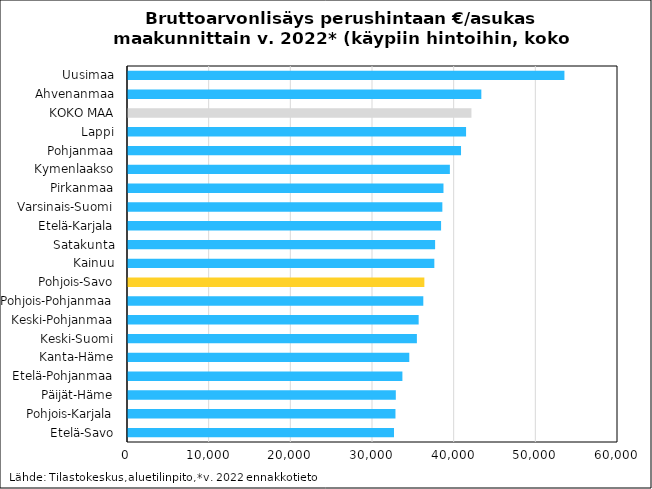
| Category | Bruttoarvonlisäys 
perushintaan 
€/asukas |
|---|---|
| Etelä-Savo | 32571.2 |
| Pohjois-Karjala | 32750 |
| Päijät-Häme | 32793.8 |
| Etelä-Pohjanmaa | 33600 |
| Kanta-Häme | 34442.8 |
| Keski-Suomi | 35374.6 |
| Keski-Pohjanmaa | 35591 |
| Pohjois-Pohjanmaa | 36160.7 |
| Pohjois-Savo | 36289.2 |
| Kainuu | 37510.7 |
| Satakunta | 37605.2 |
| Etelä-Karjala | 38335.8 |
| Varsinais-Suomi | 38491.2 |
| Pirkanmaa | 38629.4 |
| Kymenlaakso | 39413.2 |
| Pohjanmaa | 40778.7 |
| Lappi | 41396.8 |
| KOKO MAA | 42052.7 |
| Ahvenanmaa | 43265.6 |
| Uusimaa | 53439.9 |